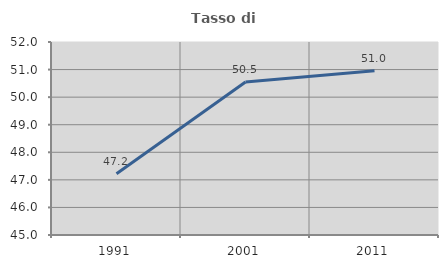
| Category | Tasso di occupazione   |
|---|---|
| 1991.0 | 47.22 |
| 2001.0 | 50.546 |
| 2011.0 | 50.96 |